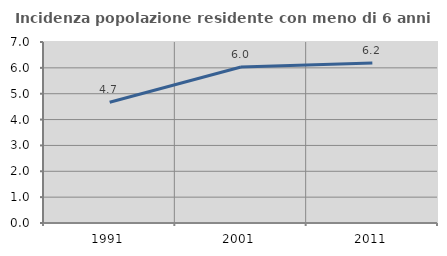
| Category | Incidenza popolazione residente con meno di 6 anni |
|---|---|
| 1991.0 | 4.671 |
| 2001.0 | 6.032 |
| 2011.0 | 6.19 |